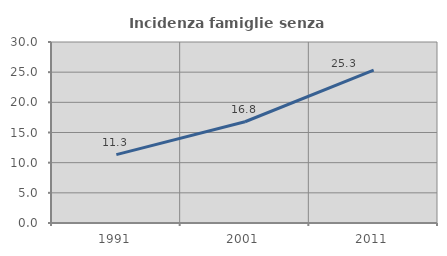
| Category | Incidenza famiglie senza nuclei |
|---|---|
| 1991.0 | 11.327 |
| 2001.0 | 16.781 |
| 2011.0 | 25.33 |